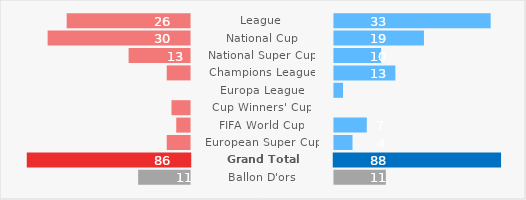
| Category | Helper Column 1 |  Barcelona  | Helper Column 2 |  Real Madrid  | Helper Column 3 |
|---|---|---|---|---|---|
| League | 14 | 26 | 30 | 33 | 7 |
| National Cup | 10 | 30 | 30 | 19 | 21 |
| National Super Cup | 27 | 13 | 30 | 10 | 30 |
| Champions League | 35 | 5 | 30 | 13 | 27 |
| Europa League | 40 | 0 | 30 | 2 | 38 |
| Cup Winners' Cup | 36 | 4 | 30 | 0 | 40 |
| FIFA World Cup | 37 | 3 | 30 | 7 | 33 |
| European Super Cup | 35 | 5 | 30 | 4 | 36 |
| Grand Total Cups | 14 | 86 | 74 | 88 | 12 |
| Ballon D'ors | 29 | 11 | 30 | 11 | 29 |